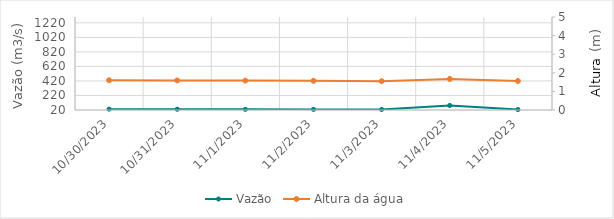
| Category | Vazão |
|---|---|
| 5/11/23 | 707.71 |
| 5/10/23 | 675.19 |
| 5/9/23 | 721.38 |
| 5/8/23 | 709.96 |
| 5/7/23 | 610.29 |
| 5/6/23 | 593.21 |
| 5/5/23 | 570.43 |